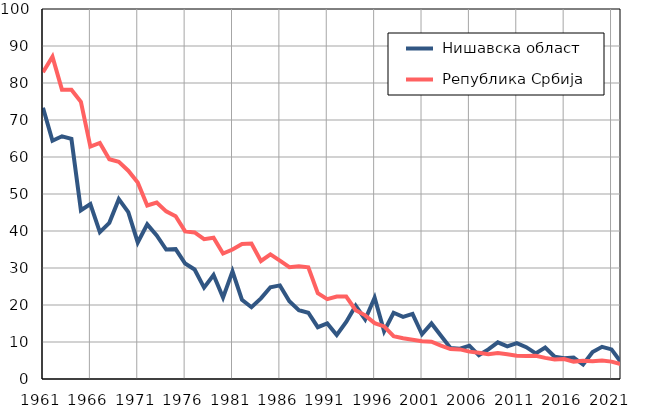
| Category |  Нишавска област |  Република Србија |
|---|---|---|
| 1961.0 | 73.3 | 82.9 |
| 1962.0 | 64.4 | 87.1 |
| 1963.0 | 65.6 | 78.2 |
| 1964.0 | 64.9 | 78.2 |
| 1965.0 | 45.6 | 74.9 |
| 1966.0 | 47.3 | 62.8 |
| 1967.0 | 39.7 | 63.8 |
| 1968.0 | 42.2 | 59.4 |
| 1969.0 | 48.6 | 58.7 |
| 1970.0 | 45.1 | 56.3 |
| 1971.0 | 36.9 | 53.1 |
| 1972.0 | 41.8 | 46.9 |
| 1973.0 | 38.8 | 47.7 |
| 1974.0 | 35 | 45.3 |
| 1975.0 | 35.1 | 44 |
| 1976.0 | 31.2 | 39.9 |
| 1977.0 | 29.6 | 39.6 |
| 1978.0 | 24.7 | 37.8 |
| 1979.0 | 28.1 | 38.2 |
| 1980.0 | 22 | 33.9 |
| 1981.0 | 29.1 | 35 |
| 1982.0 | 21.4 | 36.5 |
| 1983.0 | 19.4 | 36.6 |
| 1984.0 | 21.8 | 31.9 |
| 1985.0 | 24.8 | 33.7 |
| 1986.0 | 25.3 | 32 |
| 1987.0 | 21 | 30.2 |
| 1988.0 | 18.6 | 30.5 |
| 1989.0 | 17.9 | 30.2 |
| 1990.0 | 14 | 23.2 |
| 1991.0 | 15 | 21.6 |
| 1992.0 | 11.9 | 22.3 |
| 1993.0 | 15.4 | 22.3 |
| 1994.0 | 19.8 | 18.6 |
| 1995.0 | 16.1 | 17.2 |
| 1996.0 | 22 | 15.1 |
| 1997.0 | 12.9 | 14.2 |
| 1998.0 | 17.9 | 11.6 |
| 1999.0 | 16.8 | 11 |
| 2000.0 | 17.6 | 10.6 |
| 2001.0 | 12.1 | 10.2 |
| 2002.0 | 15 | 10.1 |
| 2003.0 | 11.7 | 9 |
| 2004.0 | 8.4 | 8.1 |
| 2005.0 | 8.2 | 8 |
| 2006.0 | 9 | 7.4 |
| 2007.0 | 6.4 | 7.1 |
| 2008.0 | 8 | 6.7 |
| 2009.0 | 9.9 | 7 |
| 2010.0 | 8.8 | 6.7 |
| 2011.0 | 9.7 | 6.3 |
| 2012.0 | 8.6 | 6.2 |
| 2013.0 | 6.9 | 6.3 |
| 2014.0 | 8.5 | 5.7 |
| 2015.0 | 6 | 5.3 |
| 2016.0 | 5.6 | 5.4 |
| 2017.0 | 5.8 | 4.7 |
| 2018.0 | 3.9 | 4.9 |
| 2019.0 | 7.3 | 4.8 |
| 2020.0 | 8.7 | 5 |
| 2021.0 | 8 | 4.7 |
| 2022.0 | 4.5 | 4 |